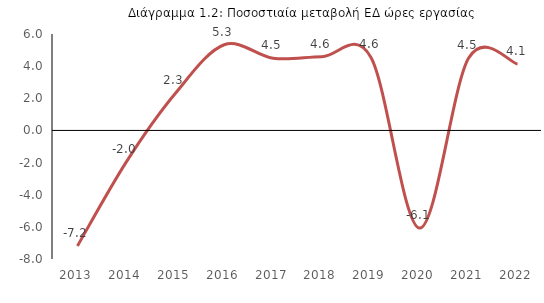
| Category | Aπασχόληση (ώρες εργασίας ΕΔ Στατ. Υπηρ.) % |
|---|---|
| 2013.0 | -7.187 |
| 2014.0 | -1.954 |
| 2015.0 | 2.299 |
| 2016.0 | 5.333 |
| 2017.0 | 4.494 |
| 2018.0 | 4.589 |
| 2019.0 | 4.555 |
| 2020.0 | -6.078 |
| 2021.0 | 4.502 |
| 2022.0 | 4.131 |